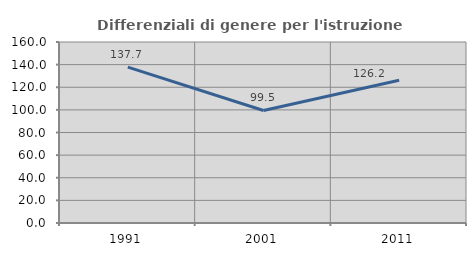
| Category | Differenziali di genere per l'istruzione superiore |
|---|---|
| 1991.0 | 137.744 |
| 2001.0 | 99.457 |
| 2011.0 | 126.225 |